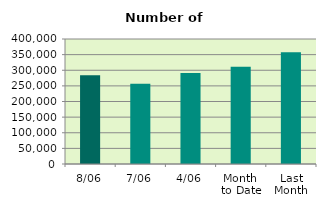
| Category | Series 0 |
|---|---|
| 8/06 | 283814 |
| 7/06 | 257194 |
| 4/06 | 291406 |
| Month 
to Date | 311325.667 |
| Last
Month | 357760.286 |